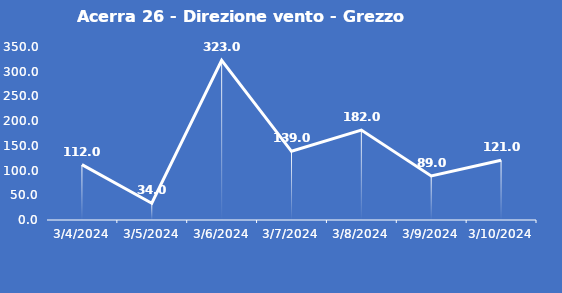
| Category | Acerra 26 - Direzione vento - Grezzo (°N) |
|---|---|
| 3/4/24 | 112 |
| 3/5/24 | 34 |
| 3/6/24 | 323 |
| 3/7/24 | 139 |
| 3/8/24 | 182 |
| 3/9/24 | 89 |
| 3/10/24 | 121 |